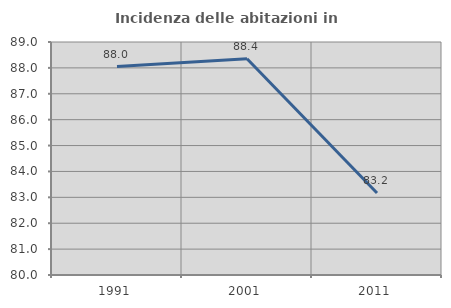
| Category | Incidenza delle abitazioni in proprietà  |
|---|---|
| 1991.0 | 88.05 |
| 2001.0 | 88.355 |
| 2011.0 | 83.169 |